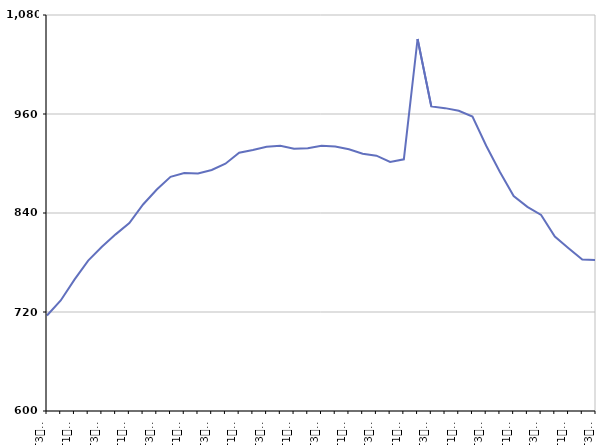
| Category | 50 ans ou plus |
|---|---|
| T3
2013 | 715.7 |
| T4
2013 | 734 |
| T1
2014 | 759.2 |
| T2
2014 | 782.3 |
| T3
2014 | 799 |
| T4
2014 | 814.1 |
| T1
2015 | 827.8 |
| T2
2015 | 850.3 |
| T3
2015 | 868.4 |
| T4
2015 | 883.8 |
| T1
2016 | 888.4 |
| T2
2016 | 888 |
| T3
2016 | 892.2 |
| T4
2016 | 899.8 |
| T1
2017 | 913 |
| T2
2017 | 916.3 |
| T3
2017 | 920.4 |
| T4
2017 | 921.6 |
| T1
2018 | 917.8 |
| T2
2018 | 918.5 |
| T3
2018 | 921.6 |
| T4
2018 | 920.7 |
| T1
2019 | 917.2 |
| T2
2019 | 911.9 |
| T3
2019 | 909.5 |
| T4
2019 | 901.9 |
| T1
2020 | 905.1 |
| T2
2020 | 1050.9 |
| T3
2020 | 969.2 |
| T4
2020 | 967.1 |
| T1
2021 | 963.9 |
| T2
2021 | 956.9 |
| T3
2021 | 921.5 |
| T4
2021 | 889.6 |
| T1
2022 | 860.6 |
| T2
2022 | 847.4 |
| T3
2022 | 837.7 |
| T4
2022 | 811.4 |
| T1
2023 | 797.4 |
| T2
2023 | 783.5 |
| T3
2023 | 783.1 |